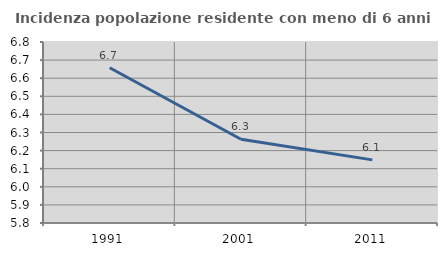
| Category | Incidenza popolazione residente con meno di 6 anni |
|---|---|
| 1991.0 | 6.657 |
| 2001.0 | 6.263 |
| 2011.0 | 6.149 |